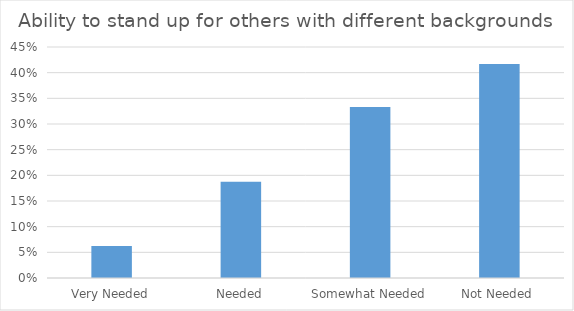
| Category | Ability to stand up for others with different backgrounds  |
|---|---|
| Very Needed | 0.062 |
| Needed | 0.188 |
| Somewhat Needed | 0.333 |
| Not Needed | 0.417 |